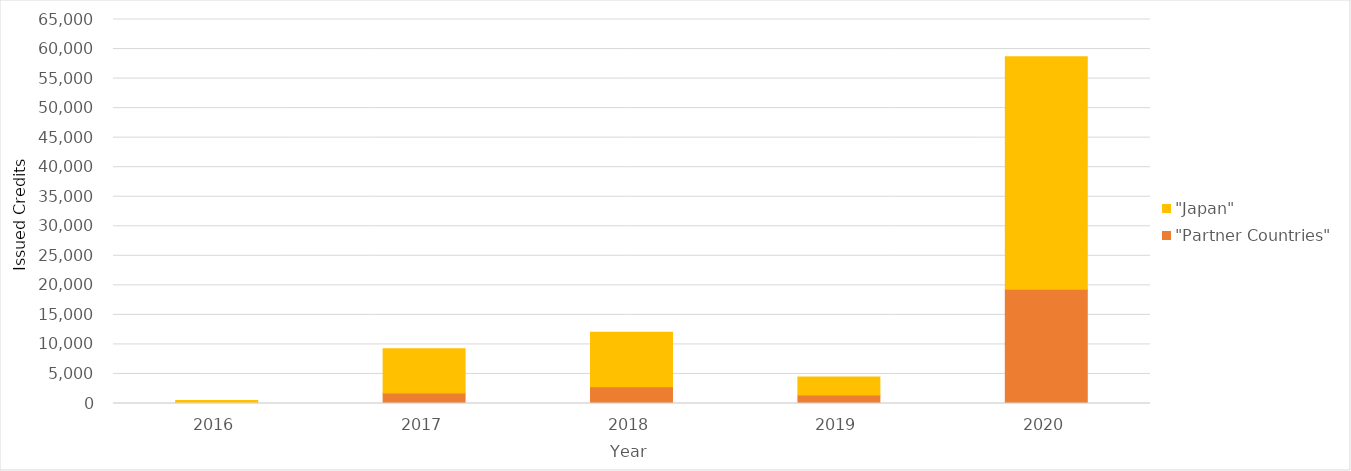
| Category | "Partner Countries" | "Japan" |
|---|---|---|
| 2016.0 | 115 | 378 |
| 2017.0 | 1789 | 7464 |
| 2018.0 | 2831 | 9237 |
| 2019.0 | 1441 | 3031 |
| 2020.0 | 19355 | 39320 |